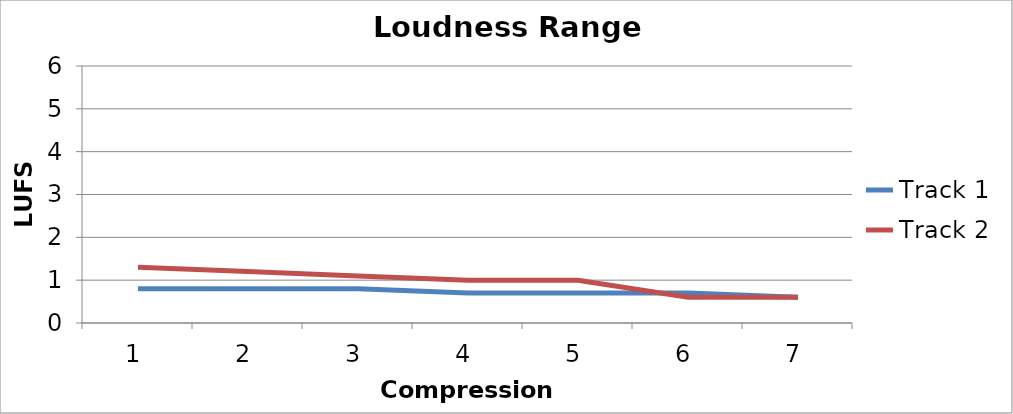
| Category | Track 1 | Track 2 |
|---|---|---|
| 0 | 0.8 | 1.3 |
| 1 | 0.8 | 1.2 |
| 2 | 0.8 | 1.1 |
| 3 | 0.7 | 1 |
| 4 | 0.7 | 1 |
| 5 | 0.7 | 0.6 |
| 6 | 0.6 | 0.6 |